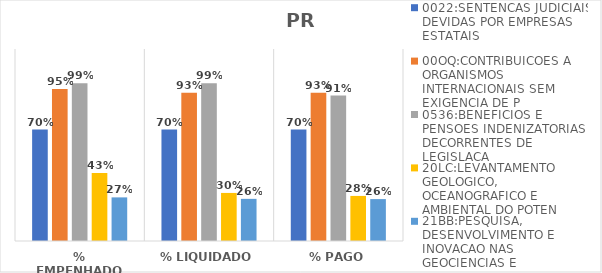
| Category | 0022:SENTENCAS JUDICIAIS DEVIDAS POR EMPRESAS ESTATAIS | 00OQ:CONTRIBUICOES A ORGANISMOS INTERNACIONAIS SEM EXIGENCIA DE P | 0536:BENEFICIOS E PENSOES INDENIZATORIAS DECORRENTES DE LEGISLACA | 20LC:LEVANTAMENTO GEOLOGICO, OCEANOGRAFICO E AMBIENTAL DO POTEN | 21BB:PESQUISA, DESENVOLVIMENTO E INOVACAO NAS GEOCIENCIAS E |
|---|---|---|---|---|---|
| % EMPENHADO | 0.697 | 0.95 | 0.985 | 0.425 | 0.273 |
| % LIQUIDADO | 0.697 | 0.926 | 0.985 | 0.3 | 0.263 |
| % PAGO | 0.697 | 0.926 | 0.909 | 0.282 | 0.262 |